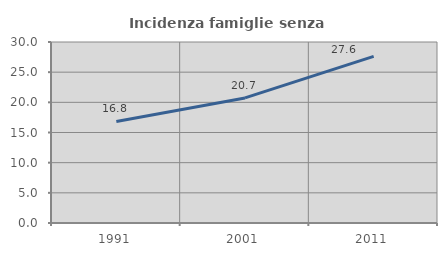
| Category | Incidenza famiglie senza nuclei |
|---|---|
| 1991.0 | 16.831 |
| 2001.0 | 20.73 |
| 2011.0 | 27.62 |